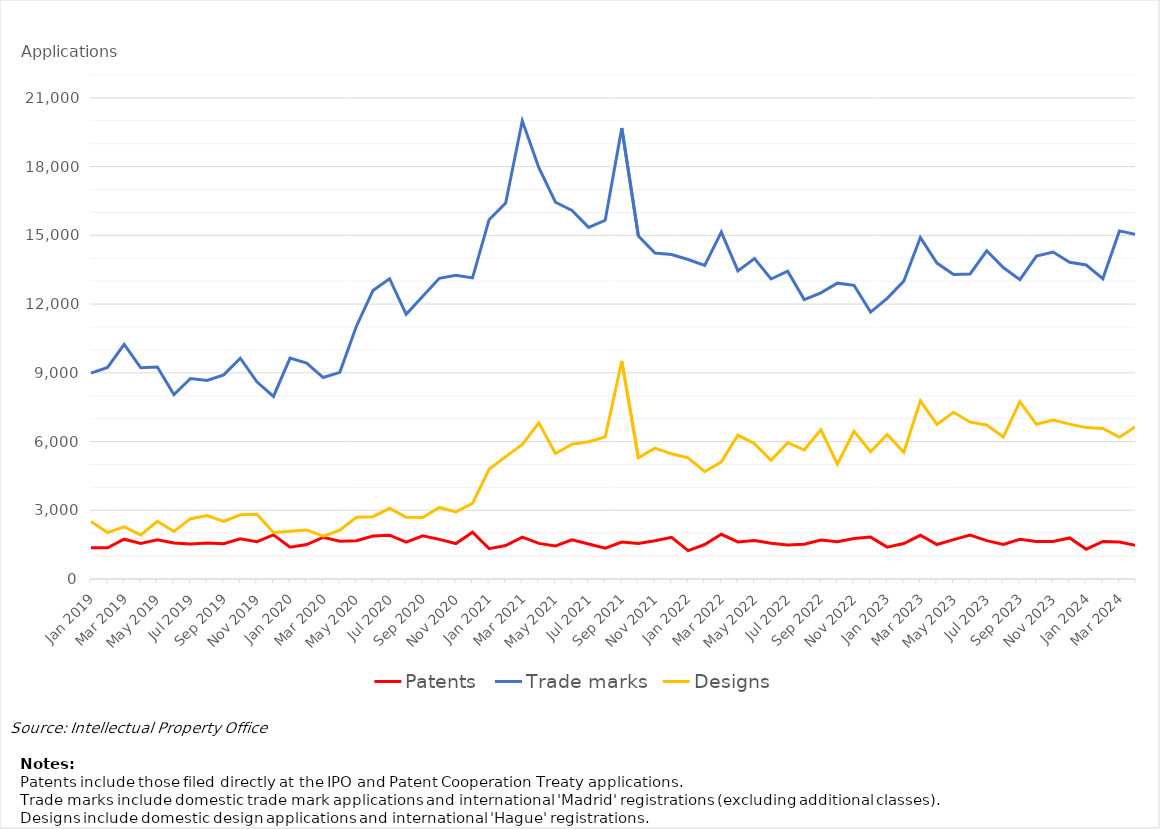
| Category | Patents | Trade marks | Designs |
|---|---|---|---|
| Jan 2019 | 1367 | 8985 | 2505 |
| Feb 2019 | 1361 | 9234 | 2031 |
| Mar 2019 | 1737 | 10243 | 2274 |
| Apr 2019 | 1552 | 9219 | 1923 |
| May 2019 | 1710 | 9251 | 2520 |
| Jun 2019 | 1569 | 8053 | 2074 |
| Jul 2019 | 1527 | 8752 | 2634 |
| Aug 2019 | 1570 | 8670 | 2768 |
| Sep 2019 | 1540 | 8908 | 2511 |
| Oct 2019 | 1755 | 9636 | 2800 |
| Nov 2019 | 1630 | 8607 | 2827 |
| Dec 2019 | 1927 | 7970 | 2028 |
| Jan 2020 | 1391 | 9642 | 2082 |
| Feb 2020 | 1504 | 9428 | 2143 |
| Mar 2020 | 1819 | 8794 | 1872 |
| Apr 2020 | 1648 | 9021 | 2127 |
| May 2020 | 1672 | 11035 | 2695 |
| Jun 2020 | 1879 | 12593 | 2721 |
| Jul 2020 | 1912 | 13110 | 3086 |
| Aug 2020 | 1613 | 11551 | 2695 |
| Sep 2020 | 1886 | 12340 | 2686 |
| Oct 2020 | 1730 | 13126 | 3124 |
| Nov 2020 | 1548 | 13254 | 2930 |
| Dec 2020 | 2042 | 13144 | 3302 |
| Jan 2021 | 1324 | 15685 | 4792 |
| Feb 2021 | 1462 | 16413 | 5340 |
| Mar 2021 | 1828 | 20001 | 5878 |
| Apr 2021 | 1554 | 17951 | 6815 |
| May 2021 | 1446 | 16446 | 5480 |
| Jun 2021 | 1712 | 16090 | 5881 |
| Jul 2021 | 1528 | 15347 | 5989 |
| Aug 2021 | 1344 | 15659 | 6200 |
| Sep 2021 | 1615 | 19685 | 9517 |
| Oct 2021 | 1547 | 14968 | 5292 |
| Nov 2021 | 1670 | 14232 | 5712 |
| Dec 2021 | 1817 | 14162 | 5464 |
| Jan 2022 | 1240 | 13945 | 5287 |
| Feb 2022 | 1505 | 13690 | 4683 |
| Mar 2022 | 1952 | 15142 | 5114 |
| Apr 2022 | 1616 | 13450 | 6282 |
| May 2022 | 1683 | 13992 | 5907 |
| Jun 2022 | 1561 | 13096 | 5183 |
| Jul 2022 | 1483 | 13439 | 5948 |
| Aug 2022 | 1519 | 12197 | 5639 |
| Sep 2022 | 1703 | 12493 | 6515 |
| Oct 2022 | 1628 | 12914 | 5013 |
| Nov 2022 | 1770 | 12819 | 6447 |
| Dec 2022 | 1828 | 11650 | 5558 |
| Jan 2023 | 1390 | 12250 | 6307 |
| Feb 2023 | 1550 | 13001 | 5528 |
| Mar 2023 | 1908 | 14909 | 7774 |
| Apr 2023 | 1504 | 13791 | 6745 |
| May 2023 | 1717 | 13291 | 7281 |
| Jun 2023 | 1920 | 13316 | 6845 |
| Jul 2023 | 1675 | 14328 | 6721 |
| Aug 2023 | 1507 | 13594 | 6196 |
| Sep 2023 | 1731 | 13064 | 7742 |
| Oct 2023 | 1641 | 14095 | 6752 |
| Nov 2023 | 1637 | 14270 | 6937 |
| Dec 2023 | 1792 | 13823 | 6760 |
| Jan 2024 | 1300 | 13707 | 6608 |
| Feb 2024 | 1639 | 13105 | 6568 |
| Mar 2024 | 1614 | 15195 | 6192 |
| April 2024 | 1460 | 15038 | 6666 |